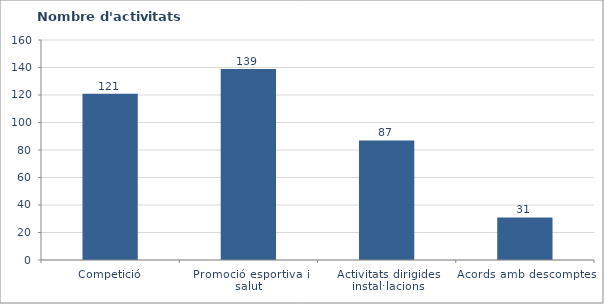
| Category | Nombre d'activitats ofertades |
|---|---|
| Competició | 121 |
| Promoció esportiva i salut | 139 |
| Activitats dirigides instal·lacions | 87 |
| Acords amb descomptes | 31 |